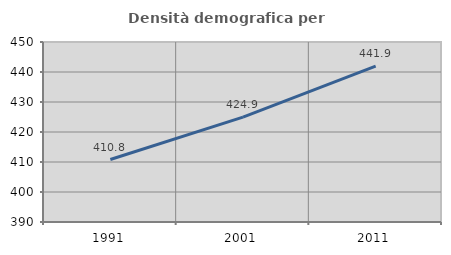
| Category | Densità demografica |
|---|---|
| 1991.0 | 410.817 |
| 2001.0 | 424.939 |
| 2011.0 | 441.943 |